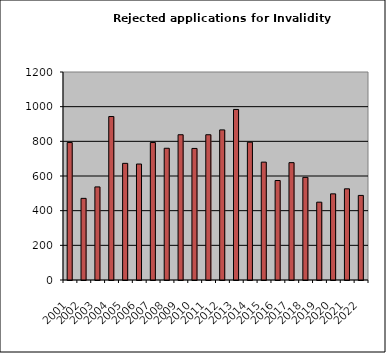
| Category | Series 0 |
|---|---|
| 2001.0 | 793 |
| 2002.0 | 471 |
| 2003.0 | 537 |
| 2004.0 | 943 |
| 2005.0 | 673 |
| 2006.0 | 669 |
| 2007.0 | 793 |
| 2008.0 | 760 |
| 2009.0 | 838 |
| 2010.0 | 759 |
| 2011.0 | 838 |
| 2012.0 | 866 |
| 2013.0 | 984 |
| 2014.0 | 795 |
| 2015.0 | 680 |
| 2016.0 | 574 |
| 2017.0 | 677 |
| 2018.0 | 592 |
| 2019.0 | 449 |
| 2020.0 | 497 |
| 2021.0 | 526 |
| 2022.0 | 488 |